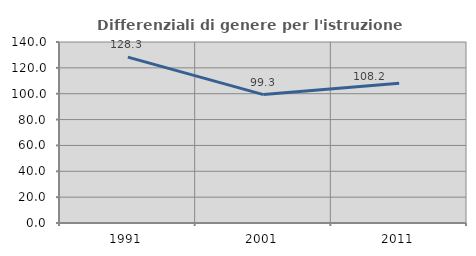
| Category | Differenziali di genere per l'istruzione superiore |
|---|---|
| 1991.0 | 128.316 |
| 2001.0 | 99.309 |
| 2011.0 | 108.182 |